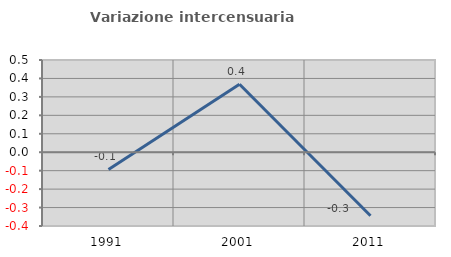
| Category | Variazione intercensuaria annua |
|---|---|
| 1991.0 | -0.093 |
| 2001.0 | 0.368 |
| 2011.0 | -0.345 |